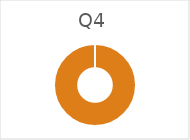
| Category | Q4 |
|---|---|
| 0 | 0 |
| 1 | 143440 |